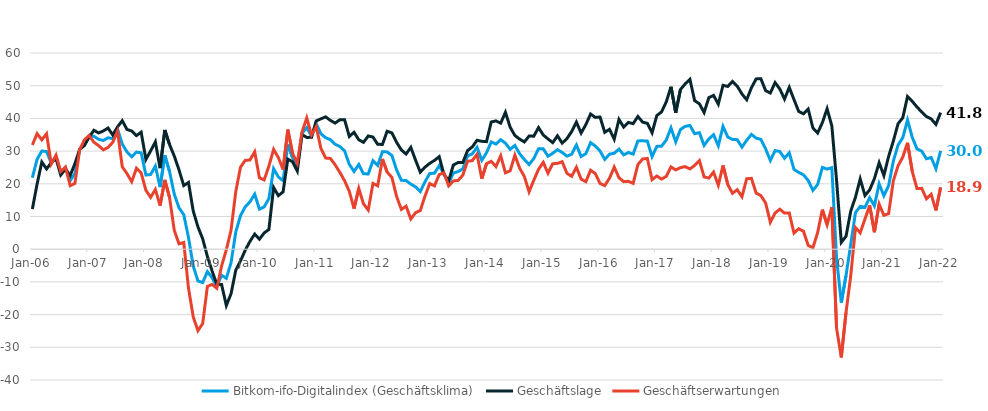
| Category | Bitkom-ifo-Digitalindex (Geschäftsklima) | Geschäftslage | Geschäftserwartungen |
|---|---|---|---|
| 2006-01-01 | 21.863 | 12.269 | 31.89 |
| 2006-02-01 | 27.511 | 19.934 | 35.349 |
| 2006-03-01 | 30.028 | 26.667 | 33.438 |
| 2006-04-01 | 29.869 | 24.556 | 35.308 |
| 2006-05-01 | 26.259 | 26.475 | 26.043 |
| 2006-06-01 | 28.266 | 27.767 | 28.767 |
| 2006-07-01 | 23.221 | 22.696 | 23.747 |
| 2006-08-01 | 24.832 | 24.531 | 25.134 |
| 2006-09-01 | 20.974 | 22.544 | 19.416 |
| 2006-10-01 | 23.142 | 26.208 | 20.117 |
| 2006-11-01 | 30.494 | 30.516 | 30.472 |
| 2006-12-01 | 32.556 | 31.691 | 33.425 |
| 2007-01-01 | 34.535 | 34.264 | 34.806 |
| 2007-02-01 | 34.542 | 36.364 | 32.734 |
| 2007-03-01 | 33.607 | 35.559 | 31.671 |
| 2007-04-01 | 33.255 | 36.163 | 30.383 |
| 2007-05-01 | 34.07 | 37.046 | 31.13 |
| 2007-06-01 | 33.816 | 34.931 | 32.705 |
| 2007-07-01 | 36.759 | 37.402 | 36.118 |
| 2007-08-01 | 32.164 | 39.31 | 25.231 |
| 2007-09-01 | 29.763 | 36.617 | 23.107 |
| 2007-10-01 | 28.269 | 36.151 | 20.65 |
| 2007-11-01 | 29.694 | 34.748 | 24.749 |
| 2007-12-01 | 29.47 | 35.783 | 23.326 |
| 2008-01-01 | 22.685 | 27.448 | 18.021 |
| 2008-02-01 | 22.844 | 30.06 | 15.855 |
| 2008-03-01 | 25.429 | 32.817 | 18.275 |
| 2008-04-01 | 18.986 | 24.778 | 13.344 |
| 2008-05-01 | 28.695 | 36.452 | 21.193 |
| 2008-06-01 | 23.744 | 31.984 | 15.796 |
| 2008-07-01 | 16.82 | 28.478 | 5.756 |
| 2008-08-01 | 12.643 | 24.246 | 1.641 |
| 2008-09-01 | 10.572 | 19.453 | 2.05 |
| 2008-10-01 | 3.629 | 20.408 | -11.872 |
| 2008-11-01 | -5.142 | 11.707 | -20.65 |
| 2008-12-01 | -9.706 | 6.834 | -24.923 |
| 2009-01-01 | -10.211 | 3.203 | -22.74 |
| 2009-02-01 | -6.861 | -2.228 | -11.385 |
| 2009-03-01 | -8.758 | -6.713 | -10.781 |
| 2009-04-01 | -11.359 | -10.776 | -11.941 |
| 2009-05-01 | -7.973 | -10.785 | -5.12 |
| 2009-06-01 | -8.905 | -17.22 | -0.211 |
| 2009-07-01 | -4.14 | -13.633 | 5.837 |
| 2009-08-01 | 5.27 | -6.413 | 17.658 |
| 2009-09-01 | 10.274 | -3.565 | 25.088 |
| 2009-10-01 | 12.98 | -0.316 | 27.161 |
| 2009-11-01 | 14.48 | 2.392 | 27.291 |
| 2009-12-01 | 16.831 | 4.624 | 29.765 |
| 2010-01-01 | 12.235 | 3.061 | 21.824 |
| 2010-02-01 | 12.929 | 4.976 | 21.191 |
| 2010-03-01 | 15.498 | 6.023 | 25.409 |
| 2010-04-01 | 24.627 | 18.869 | 30.535 |
| 2010-05-01 | 22.106 | 16.368 | 27.996 |
| 2010-06-01 | 20.931 | 17.532 | 24.383 |
| 2010-07-01 | 32.008 | 27.547 | 36.556 |
| 2010-08-01 | 28.028 | 26.731 | 29.333 |
| 2010-09-01 | 25.104 | 23.911 | 26.303 |
| 2010-10-01 | 35.435 | 35.047 | 35.823 |
| 2010-11-01 | 37.164 | 34.191 | 40.174 |
| 2010-12-01 | 34.566 | 34.201 | 34.932 |
| 2011-01-01 | 38.352 | 39.232 | 37.475 |
| 2011-02-01 | 35.302 | 39.875 | 30.816 |
| 2011-03-01 | 34.086 | 40.471 | 27.87 |
| 2011-04-01 | 33.506 | 39.39 | 27.766 |
| 2011-05-01 | 32.098 | 38.561 | 25.81 |
| 2011-06-01 | 31.403 | 39.592 | 23.494 |
| 2011-07-01 | 30.077 | 39.594 | 20.938 |
| 2011-08-01 | 25.922 | 34.474 | 17.683 |
| 2011-09-01 | 23.779 | 35.747 | 12.418 |
| 2011-10-01 | 25.904 | 33.474 | 18.579 |
| 2011-11-01 | 23.069 | 32.68 | 13.855 |
| 2011-12-01 | 23.009 | 34.628 | 11.965 |
| 2012-01-01 | 27.093 | 34.301 | 20.106 |
| 2012-02-01 | 25.642 | 32.063 | 19.399 |
| 2012-03-01 | 29.806 | 32.051 | 27.583 |
| 2012-04-01 | 29.747 | 36.073 | 23.591 |
| 2012-05-01 | 28.654 | 35.564 | 21.947 |
| 2012-06-01 | 24.245 | 32.667 | 16.127 |
| 2012-07-01 | 21.073 | 30.363 | 12.158 |
| 2012-08-01 | 20.99 | 29.108 | 13.16 |
| 2012-09-01 | 19.912 | 31.136 | 9.233 |
| 2012-10-01 | 19.061 | 27.259 | 11.16 |
| 2012-11-01 | 17.612 | 23.554 | 11.829 |
| 2012-12-01 | 20.629 | 25.106 | 16.24 |
| 2013-01-01 | 23.146 | 26.251 | 20.085 |
| 2013-02-01 | 23.225 | 27.159 | 19.36 |
| 2013-03-01 | 25.54 | 28.296 | 22.817 |
| 2013-04-01 | 23.13 | 22.879 | 23.381 |
| 2013-05-01 | 20.152 | 20.927 | 19.379 |
| 2013-06-01 | 23.3 | 25.757 | 20.869 |
| 2013-07-01 | 23.75 | 26.498 | 21.035 |
| 2013-08-01 | 24.59 | 26.531 | 22.666 |
| 2013-09-01 | 28.517 | 30.155 | 26.891 |
| 2013-10-01 | 29.173 | 31.283 | 27.082 |
| 2013-11-01 | 31.159 | 33.31 | 29.028 |
| 2013-12-01 | 27.194 | 32.987 | 21.546 |
| 2014-01-01 | 29.492 | 32.895 | 26.139 |
| 2014-02-01 | 32.805 | 38.902 | 26.864 |
| 2014-03-01 | 32.147 | 39.242 | 25.262 |
| 2014-04-01 | 33.497 | 38.534 | 28.566 |
| 2014-05-01 | 32.427 | 41.862 | 23.36 |
| 2014-06-01 | 30.549 | 37.316 | 23.974 |
| 2014-07-01 | 31.743 | 34.773 | 28.752 |
| 2014-08-01 | 29.196 | 33.677 | 24.801 |
| 2014-09-01 | 27.457 | 32.797 | 22.238 |
| 2014-10-01 | 25.904 | 34.588 | 17.542 |
| 2014-11-01 | 27.729 | 34.575 | 21.083 |
| 2014-12-01 | 30.74 | 37.201 | 24.454 |
| 2015-01-01 | 30.692 | 34.912 | 26.547 |
| 2015-02-01 | 28.415 | 33.718 | 23.232 |
| 2015-03-01 | 29.338 | 32.588 | 26.134 |
| 2015-04-01 | 30.426 | 34.682 | 26.247 |
| 2015-05-01 | 29.575 | 32.444 | 26.741 |
| 2015-06-01 | 28.461 | 33.82 | 23.224 |
| 2015-07-01 | 29.036 | 35.986 | 22.291 |
| 2015-08-01 | 31.867 | 38.882 | 25.058 |
| 2015-09-01 | 28.377 | 35.514 | 21.455 |
| 2015-10-01 | 29.203 | 38.096 | 20.641 |
| 2015-11-01 | 32.588 | 41.34 | 24.153 |
| 2015-12-01 | 31.556 | 40.299 | 23.13 |
| 2016-01-01 | 30.048 | 40.429 | 20.114 |
| 2016-02-01 | 27.454 | 35.741 | 19.457 |
| 2016-03-01 | 29.066 | 36.66 | 21.715 |
| 2016-04-01 | 29.346 | 33.647 | 25.124 |
| 2016-05-01 | 30.606 | 39.68 | 21.874 |
| 2016-06-01 | 28.849 | 37.345 | 20.657 |
| 2016-07-01 | 29.586 | 38.766 | 20.759 |
| 2016-08-01 | 29.075 | 38.395 | 20.121 |
| 2016-09-01 | 33.116 | 40.586 | 25.877 |
| 2016-10-01 | 33.153 | 38.863 | 27.581 |
| 2016-11-01 | 33.063 | 38.485 | 27.764 |
| 2016-12-01 | 28.309 | 35.585 | 21.259 |
| 2017-01-01 | 31.442 | 40.869 | 22.384 |
| 2017-02-01 | 31.49 | 41.99 | 21.446 |
| 2017-03-01 | 33.383 | 45.047 | 22.273 |
| 2017-04-01 | 37.109 | 49.681 | 25.171 |
| 2017-05-01 | 32.822 | 41.72 | 24.252 |
| 2017-06-01 | 36.597 | 48.842 | 24.954 |
| 2017-07-01 | 37.564 | 50.553 | 25.249 |
| 2017-08-01 | 37.849 | 51.938 | 24.548 |
| 2017-09-01 | 35.317 | 45.422 | 25.628 |
| 2017-10-01 | 35.633 | 44.475 | 27.112 |
| 2017-11-01 | 31.734 | 41.795 | 22.091 |
| 2017-12-01 | 33.72 | 46.343 | 21.743 |
| 2018-01-01 | 35.016 | 47.033 | 23.584 |
| 2018-02-01 | 31.627 | 44.364 | 19.554 |
| 2018-03-01 | 37.558 | 50.125 | 25.622 |
| 2018-04-01 | 34.307 | 49.775 | 19.797 |
| 2018-05-01 | 33.58 | 51.32 | 17.092 |
| 2018-06-01 | 33.497 | 49.871 | 18.196 |
| 2018-07-01 | 31.219 | 47.468 | 16.037 |
| 2018-08-01 | 33.306 | 45.703 | 21.535 |
| 2018-09-01 | 35.107 | 49.363 | 21.667 |
| 2018-10-01 | 33.965 | 52.075 | 17.156 |
| 2018-11-01 | 33.587 | 52.147 | 16.393 |
| 2018-12-01 | 30.682 | 48.489 | 14.15 |
| 2019-01-01 | 27.139 | 47.766 | 8.229 |
| 2019-02-01 | 30.147 | 50.951 | 11.067 |
| 2019-03-01 | 29.883 | 49.001 | 12.232 |
| 2019-04-01 | 27.81 | 45.92 | 11.034 |
| 2019-05-01 | 29.484 | 49.497 | 11.076 |
| 2019-06-01 | 24.416 | 45.752 | 4.932 |
| 2019-07-01 | 23.469 | 42.116 | 6.257 |
| 2019-08-01 | 22.74 | 41.42 | 5.506 |
| 2019-09-01 | 21.027 | 42.866 | 1.152 |
| 2019-10-01 | 18.001 | 37.077 | 0.46 |
| 2019-11-01 | 19.78 | 35.534 | 5.08 |
| 2019-12-01 | 25.006 | 38.706 | 12.093 |
| 2020-01-01 | 24.508 | 42.939 | 7.476 |
| 2020-02-01 | 24.934 | 37.708 | 12.847 |
| 2020-03-01 | -2.827 | 21.103 | -24.166 |
| 2020-04-01 | -16.336 | 2.095 | -33.087 |
| 2020-05-01 | -8.03 | 3.94 | -19.297 |
| 2020-06-01 | 1.557 | 11.665 | -8.068 |
| 2020-07-01 | 11.226 | 15.922 | 6.633 |
| 2020-08-01 | 13.078 | 21.488 | 4.987 |
| 2020-09-01 | 12.814 | 16.42 | 9.267 |
| 2020-10-01 | 15.749 | 18.151 | 13.372 |
| 2020-11-01 | 13.238 | 21.584 | 5.206 |
| 2020-12-01 | 20.042 | 26.456 | 13.81 |
| 2021-01-01 | 16.352 | 22.533 | 10.343 |
| 2021-02-01 | 19.425 | 28.343 | 10.855 |
| 2021-03-01 | 26.924 | 33.065 | 20.944 |
| 2021-04-01 | 31.844 | 38.365 | 25.502 |
| 2021-05-01 | 34.118 | 40.21 | 28.18 |
| 2021-06-01 | 39.514 | 46.708 | 32.53 |
| 2021-07-01 | 34.242 | 45.212 | 23.762 |
| 2021-08-01 | 30.68 | 43.498 | 18.538 |
| 2021-09-01 | 29.98 | 41.949 | 18.603 |
| 2021-10-01 | 27.652 | 40.568 | 15.43 |
| 2021-11-01 | 28.034 | 39.852 | 16.797 |
| 2021-12-01 | 24.632 | 38.162 | 11.87 |
| 2022-01-01 | 30.037 | 41.768 | 18.876 |